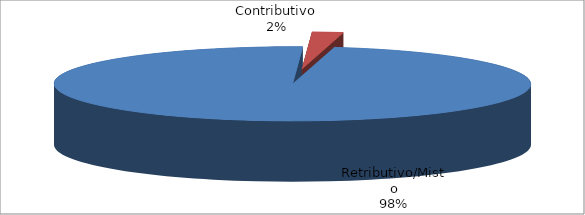
| Category | Decorrenti gennaio - settembreo 2019 |
|---|---|
| Retributivo/Misto | 119993 |
| Contributivo | 2573 |